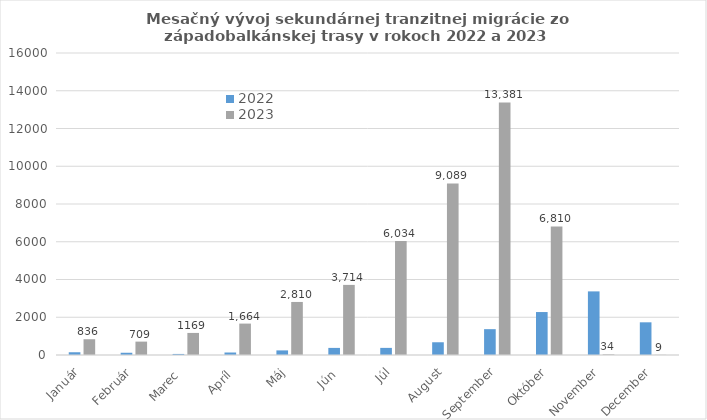
| Category | 2022 | 2023 |
|---|---|---|
| Január | 146 | 836 |
| Február | 119 | 709 |
| Marec  | 56 | 1169 |
| Apríl  | 132 | 1664 |
| Máj | 244 | 2810 |
| Jún  | 376 | 3714 |
| Júl | 377 | 6034 |
| August | 675 | 9089 |
| September | 1369 | 13381 |
| Október | 2276 | 6810 |
| November | 3370 | 34 |
| December | 1732 | 9 |